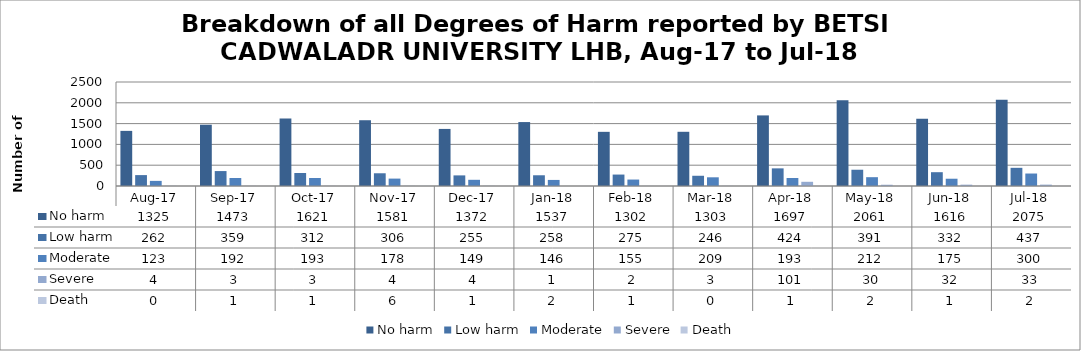
| Category | No harm | Low harm | Moderate | Severe | Death |
|---|---|---|---|---|---|
| Aug-17 | 1325 | 262 | 123 | 4 | 0 |
| Sep-17 | 1473 | 359 | 192 | 3 | 1 |
| Oct-17 | 1621 | 312 | 193 | 3 | 1 |
| Nov-17 | 1581 | 306 | 178 | 4 | 6 |
| Dec-17 | 1372 | 255 | 149 | 4 | 1 |
| Jan-18 | 1537 | 258 | 146 | 1 | 2 |
| Feb-18 | 1302 | 275 | 155 | 2 | 1 |
| Mar-18 | 1303 | 246 | 209 | 3 | 0 |
| Apr-18 | 1697 | 424 | 193 | 101 | 1 |
| May-18 | 2061 | 391 | 212 | 30 | 2 |
| Jun-18 | 1616 | 332 | 175 | 32 | 1 |
| Jul-18 | 2075 | 437 | 300 | 33 | 2 |